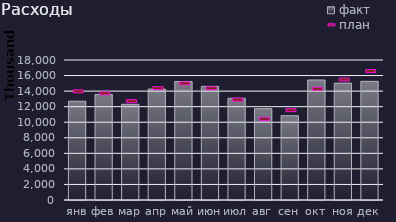
| Category | факт |
|---|---|
| янв | 12699317 |
| фев | 13575184.902 |
| мар | 12300410.305 |
| апр | 14265152.539 |
| май | 15237347.922 |
| июн | 14608624.966 |
| июл | 13078538.753 |
| авг | 11752922.808 |
| сен | 10842430 |
| окт | 15430739.684 |
| ноя | 15027981.794 |
| дек | 15256720.86 |